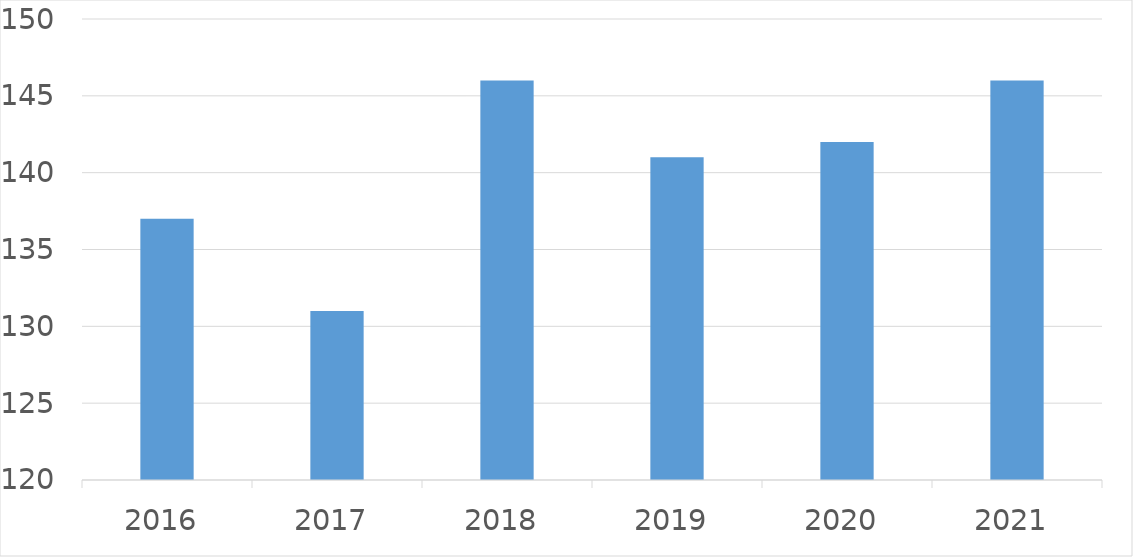
| Category | Series 0 |
|---|---|
| 2016 | 137 |
| 2017 | 131 |
| 2018 | 146 |
| 2019 | 141 |
| 2020 | 142 |
| 2021 | 146 |